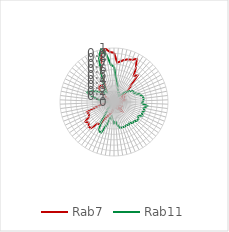
| Category | Rab7 | Rab11 |
|---|---|---|
| 0.0 | 0.913 | 0.656 |
| 0.10913 | 0.732 | 0.445 |
| 0.21825 | 0.761 | 0.373 |
| 0.32738 | 0.805 | 0.271 |
| 0.43651 | 0.832 | 0.235 |
| 0.54563 | 0.85 | 0.185 |
| 0.65476 | 0.9 | 0.197 |
| 0.76389 | 0.763 | 0.156 |
| 0.87302 | 0.61 | 0.135 |
| 0.98214 | 0.655 | 0.173 |
| 1.09127 | 0.428 | 0.243 |
| 1.2004 | 0.337 | 0.289 |
| 1.30952 | 0.18 | 0.363 |
| 1.41865 | 0.144 | 0.409 |
| 1.52778 | 0.2 | 0.404 |
| 1.6369 | 0.162 | 0.442 |
| 1.74603 | 0.18 | 0.502 |
| 1.85516 | 0.138 | 0.538 |
| 1.96429 | 0.243 | 0.555 |
| 2.07341 | 0.095 | 0.542 |
| 2.18254 | 0.165 | 0.517 |
| 2.29167 | 0.073 | 0.62 |
| 2.40079 | 0.062 | 0.559 |
| 2.50992 | 0.054 | 0.586 |
| 2.61905 | 0.102 | 0.552 |
| 2.72817 | 0.115 | 0.583 |
| 2.8373 | 0.176 | 0.519 |
| 2.94643 | 0.083 | 0.546 |
| 3.05556 | 0.079 | 0.55 |
| 3.16468 | 0.087 | 0.514 |
| 3.27381 | 0.224 | 0.52 |
| 3.38294 | 0.197 | 0.48 |
| 3.49206 | 0.1 | 0.506 |
| 3.60119 | 0.125 | 0.484 |
| 3.71032 | 0.15 | 0.501 |
| 3.81944 | 0.045 | 0.492 |
| 3.92857 | 0.072 | 0.495 |
| 4.0377 | 0 | 0.441 |
| 4.14683 | 0.126 | 0.362 |
| 4.25595 | 0.093 | 0.392 |
| 4.36508 | 0.118 | 0.334 |
| 4.47421 | 0.17 | 0.27 |
| 4.58333 | 0.154 | 0.312 |
| 4.69246 | 0.237 | 0.466 |
| 4.80159 | 0.238 | 0.617 |
| 4.91071 | 0.33 | 0.603 |
| 5.01984 | 0.491 | 0.457 |
| 5.12897 | 0.499 | 0.232 |
| 5.2381 | 0.65 | 0.175 |
| 5.34722 | 0.651 | 0.095 |
| 5.45635 | 0.607 | 0.067 |
| 5.56548 | 0.646 | 0.079 |
| 5.6746 | 0.533 | 0.072 |
| 5.78373 | 0.51 | 0.099 |
| 5.89286 | 0.536 | 0.033 |
| 6.00198 | 0.363 | 0 |
| 6.11111 | 0.236 | 0.032 |
| 6.22024 | 0.187 | 0.068 |
| 6.32937 | 0.223 | 0.1 |
| 6.43849 | 0.118 | 0.202 |
| 6.54762 | 0.102 | 0.251 |
| 6.65675 | 0.135 | 0.352 |
| 6.76587 | 0.072 | 0.449 |
| 6.875 | 0.087 | 0.531 |
| 6.98413 | 0.069 | 0.464 |
| 7.09325 | 0.147 | 0.395 |
| 7.20238 | 0.288 | 0.329 |
| 7.31151 | 0.341 | 0.303 |
| 7.42063 | 0.382 | 0.248 |
| 7.52976 | 0.401 | 0.266 |
| 7.63889 | 0.37 | 0.225 |
| 7.74802 | 0.269 | 0.302 |
| 7.85714 | 0.393 | 0.45 |
| 7.96627 | 0.621 | 0.618 |
| 8.0754 | 0.748 | 0.89 |
| 8.18452 | 0.946 | 1 |
| 8.29365 | 1 | 0.89 |
| 8.40278 | 0.929 | 0.688 |